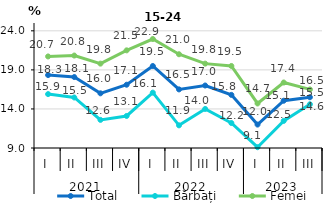
| Category | Total | Bărbați | Femei |
|---|---|---|---|
| 0 | 18.335 | 15.899 | 20.718 |
| 1 | 18.083 | 15.467 | 20.834 |
| 2 | 16 | 12.6 | 19.8 |
| 3 | 17.1 | 13.1 | 21.5 |
| 4 | 19.497 | 16.088 | 22.949 |
| 5 | 16.5 | 11.9 | 21 |
| 6 | 17 | 14 | 19.8 |
| 7 | 15.8 | 12.2 | 19.5 |
| 8 | 12 | 9.1 | 14.7 |
| 9 | 15.051 | 12.471 | 17.384 |
| 10 | 15.5 | 14.6 | 16.5 |